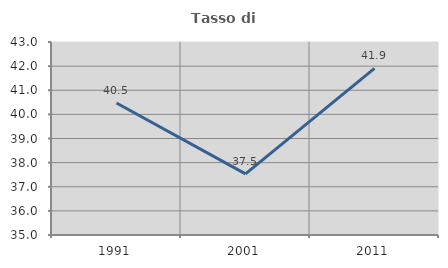
| Category | Tasso di occupazione   |
|---|---|
| 1991.0 | 40.47 |
| 2001.0 | 37.535 |
| 2011.0 | 41.908 |